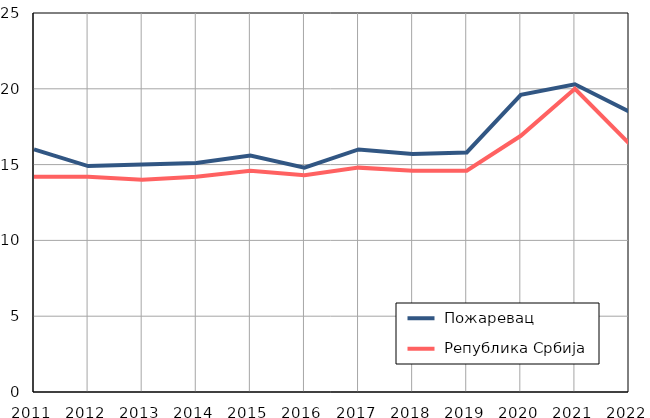
| Category |  Пожаревац |  Република Србија |
|---|---|---|
| 2011.0 | 16 | 14.2 |
| 2012.0 | 14.9 | 14.2 |
| 2013.0 | 15 | 14 |
| 2014.0 | 15.1 | 14.2 |
| 2015.0 | 15.6 | 14.6 |
| 2016.0 | 14.8 | 14.3 |
| 2017.0 | 16 | 14.8 |
| 2018.0 | 15.7 | 14.6 |
| 2019.0 | 15.8 | 14.6 |
| 2020.0 | 19.6 | 16.9 |
| 2021.0 | 20.3 | 20 |
| 2022.0 | 18.5 | 16.4 |